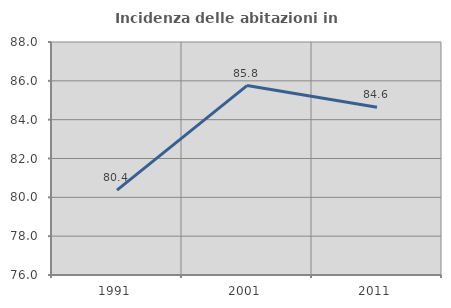
| Category | Incidenza delle abitazioni in proprietà  |
|---|---|
| 1991.0 | 80.374 |
| 2001.0 | 85.757 |
| 2011.0 | 84.637 |